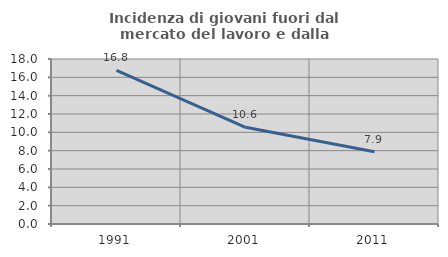
| Category | Incidenza di giovani fuori dal mercato del lavoro e dalla formazione  |
|---|---|
| 1991.0 | 16.761 |
| 2001.0 | 10.553 |
| 2011.0 | 7.883 |